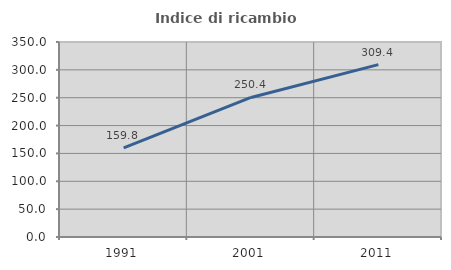
| Category | Indice di ricambio occupazionale  |
|---|---|
| 1991.0 | 159.797 |
| 2001.0 | 250.448 |
| 2011.0 | 309.355 |